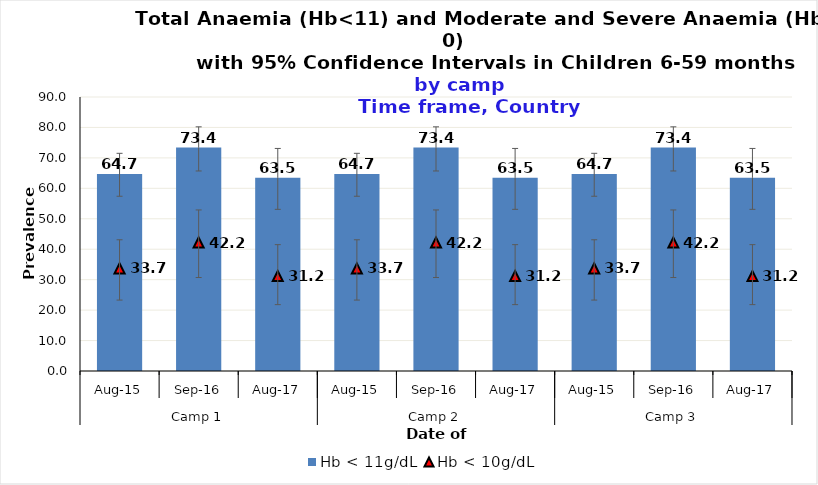
| Category | Hb < 11g/dL |
|---|---|
| 0 | 64.7 |
| 1 | 73.4 |
| 2 | 63.5 |
| 3 | 64.7 |
| 4 | 73.4 |
| 5 | 63.5 |
| 6 | 64.7 |
| 7 | 73.4 |
| 8 | 63.5 |